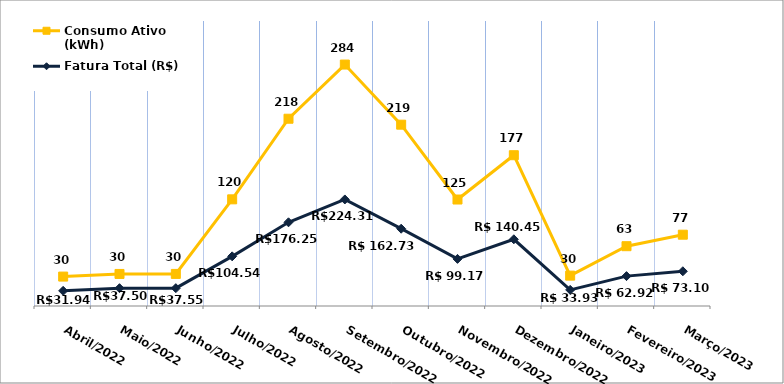
| Category | Fatura Total (R$) | Consumo Ativo (kWh) |
|---|---|---|
| Abril/2022 | 31.94 | 30 |
| Maio/2022 | 37.5 | 30 |
| Junho/2022 | 37.55 | 30 |
| Julho/2022 | 104.54 | 120 |
| Agosto/2022 | 176.25 | 218 |
| Setembro/2022 | 224.31 | 284 |
| Outubro/2022 | 162.73 | 219 |
| Novembro/2022 | 99.17 | 125 |
| Dezembro/2022 | 140.45 | 177 |
| Janeiro/2023 | 33.93 | 30 |
| Fevereiro/2023 | 62.92 | 63 |
| Março/2023 | 73.1 | 77 |